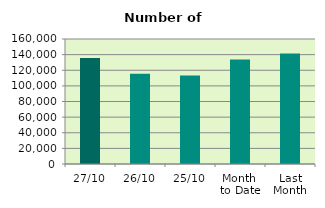
| Category | Series 0 |
|---|---|
| 27/10 | 135648 |
| 26/10 | 115628 |
| 25/10 | 113338 |
| Month 
to Date | 133752 |
| Last
Month | 141428.727 |